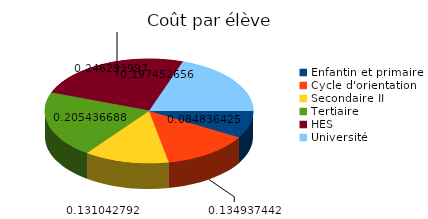
| Category | Coût (en CHF) |
|---|---|
| Enfantin et primaire | 13941 |
| Cycle d'orientation | 22174 |
| Secondaire II | 21534 |
| Tertiaire | 33759 |
| HES | 40473 |
| Université | 32447 |